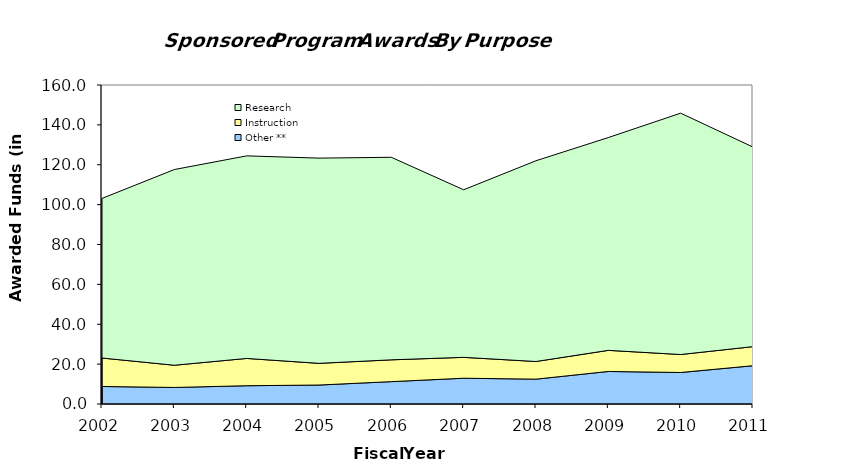
| Category | Other ** | Instruction | Research |
|---|---|---|---|
| 2002.0 | 8790540 | 14269552 | 80043495 |
| 2003.0 | 8293404 | 11147061 | 98160245 |
| 2004.0 | 9163550 | 13682608 | 101608152 |
| 2005.0 | 9513598 | 10871860 | 102942459 |
| 2006.0 | 11219718 | 10932352 | 101586645 |
| 2007.0 | 12923580 | 10473404 | 84050822 |
| 2008.0 | 12461556 | 8854473 | 100702258 |
| 2009.0 | 16323762 | 10579962 | 106738539 |
| 2010.0 | 15802845 | 9016188 | 121058086 |
| 2011.0 | 19201991 | 9571284 | 100091965 |